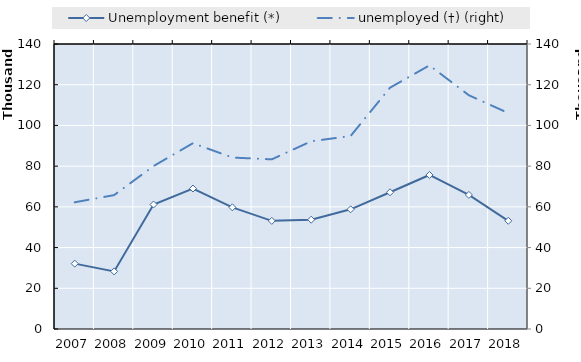
| Category | Unemployment benefit (*) | Series 1 |
|---|---|---|
| 2007.0 | 32111 |  |
| 2008.0 | 28282 |  |
| 2009.0 | 61157 |  |
| 2010.0 | 68999 |  |
| 2011.0 | 59765 |  |
| 2012.0 | 53120 |  |
| 2013.0 | 53685 |  |
| 2014.0 | 58792 |  |
| 2015.0 | 67161 |  |
| 2016.0 | 75668 |  |
| 2017.0 | 65870 |  |
| 2018.0 | 53156 |  |